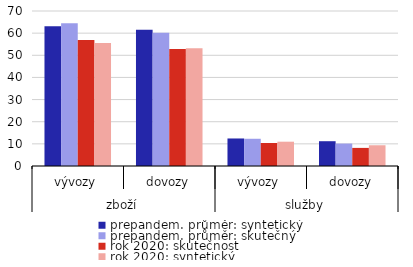
| Category | prepandem. průměr: syntetický | prepandem. průměr: skutečný | rok 2020: skutečnost | rok 2020: syntetický |
|---|---|---|---|---|
| 0 | 63.093 | 64.492 | 56.951 | 55.55 |
| 1 | 61.491 | 60.171 | 52.883 | 53.126 |
| 2 | 12.432 | 12.301 | 10.381 | 10.976 |
| 3 | 11.195 | 10.134 | 8.174 | 9.367 |